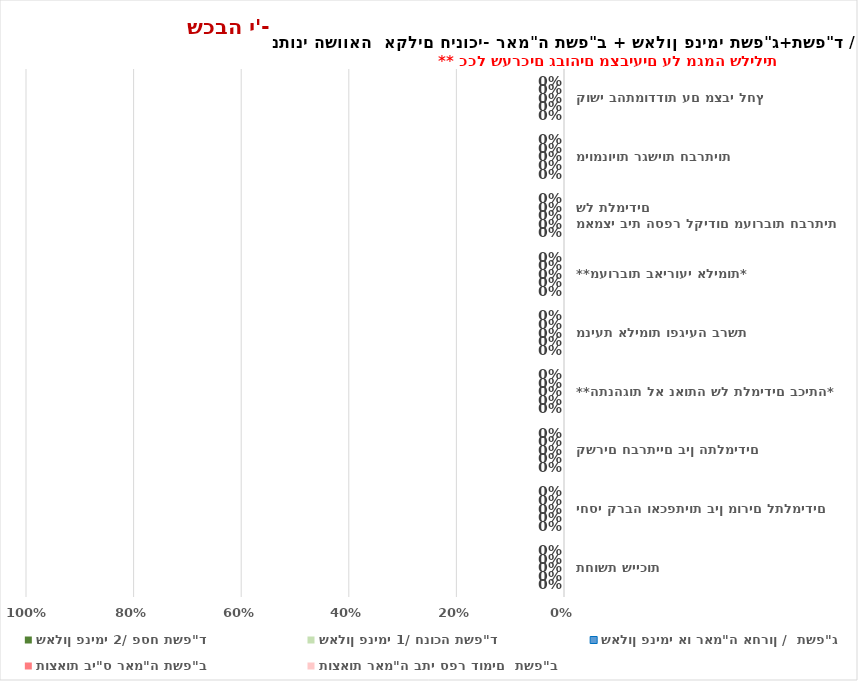
| Category | שאלון פנימי 2/ פסח תשפ"ד  | שאלון פנימי 1/ חנוכה תשפ"ד | שאלון פנימי או ראמ"ה אחרון /  תשפ"ג   | תוצאות בי"ס ראמ"ה תשפ"ב  | תוצאות ראמ"ה בתי ספר דומים  תשפ"ב |
|---|---|---|---|---|---|
| תחושת שייכות | 0 | 0 | 0 | 0 | 0 |
| יחסי קרבה ואכפתיות בין מורים לתלמידים | 0 | 0 | 0 | 0 | 0 |
| קשרים חברתיים בין התלמידים | 0 | 0 | 0 | 0 | 0 |
| **התנהגות לא נאותה של תלמידים בכיתה* | 0 | 0 | 0 | 0 | 0 |
| מניעת אלימות ופגיעה ברשת | 0 | 0 | 0 | 0 | 0 |
| **מעורבות באירועי אלימות* | 0 | 0 | 0 | 0 | 0 |
| מאמצי בית הספר לקידום מעורבות חברתית של תלמידים | 0 | 0 | 0 | 0 | 0 |
| מיומנויות רגשיות חברתיות | 0 | 0 | 0 | 0 | 0 |
| קושי בהתמודדות עם מצבי לחץ | 0 | 0 | 0 | 0 | 0 |